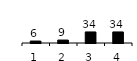
| Category | Series 0 |
|---|---|
| 1.0 | 6 |
| 2.0 | 9 |
| 3.0 | 34 |
| 4.0 | 34 |